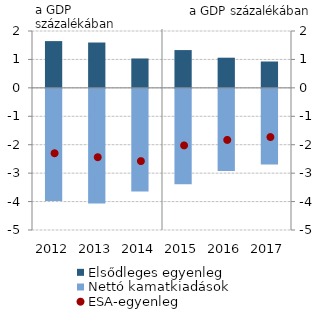
| Category | Elsődleges egyenleg |
|---|---|
| 2012.0 | 1.644 |
| 2013.0 | 1.595 |
| 2014.0 | 1.033 |
| 2015.0 | 1.329 |
| 2016.0 | 1.061 |
| 2017.0 | 0.927 |